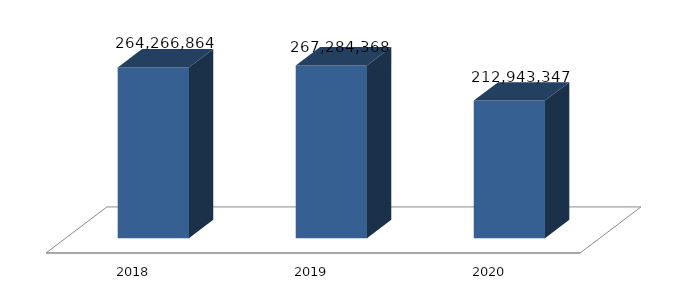
| Category | Dukungan Manajemen dan Pelaksanaan Tugas Teknis Lainnya Kementerian Komunikasi dan Informatika |
|---|---|
| 2018.0 | 264266864 |
| 2019.0 | 267284368 |
| 2020.0 | 212943347 |